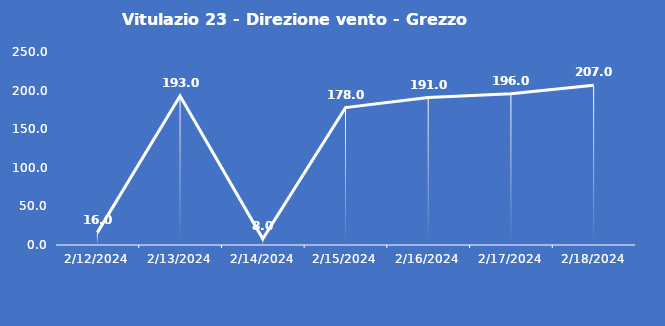
| Category | Vitulazio 23 - Direzione vento - Grezzo (°N) |
|---|---|
| 2/12/24 | 16 |
| 2/13/24 | 193 |
| 2/14/24 | 8 |
| 2/15/24 | 178 |
| 2/16/24 | 191 |
| 2/17/24 | 196 |
| 2/18/24 | 207 |